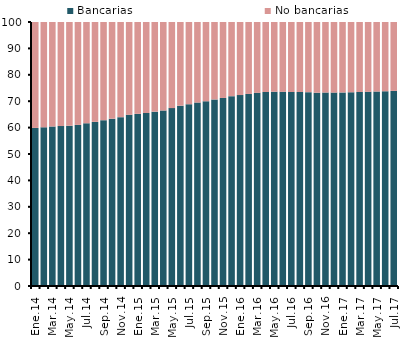
| Category | Bancarias | No bancarias |
|---|---|---|
| Ene.14 | 59.874 | 40.126 |
| Feb.14 | 60.11 | 39.89 |
| Mar.14 | 60.421 | 39.579 |
| Abr.14 | 60.587 | 39.413 |
| May.14 | 60.715 | 39.285 |
| Jun.14 | 61.019 | 38.981 |
| Jul.14 | 61.641 | 38.359 |
| Ago.14 | 62.168 | 37.832 |
| Sep.14 | 62.806 | 37.194 |
| Oct.14 | 63.38 | 36.62 |
| Nov.14 | 63.963 | 36.037 |
| Dic.14 | 64.85 | 35.15 |
| Ene.15 | 65.198 | 34.802 |
| Feb.15 | 65.527 | 34.473 |
| Mar.15 | 66.034 | 33.966 |
| Abr.15 | 66.476 | 33.524 |
| May.15 | 67.379 | 32.621 |
| Jun.15 | 68.294 | 31.706 |
| Jul.15 | 68.857 | 31.143 |
| Ago.15 | 69.482 | 30.518 |
| Sep.15 | 69.972 | 30.028 |
| Oct.15 | 70.666 | 29.334 |
| Nov.15 | 71.225 | 28.775 |
| Dic.15 | 71.91 | 28.09 |
| Ene.16 | 72.32 | 27.68 |
| Feb.16 | 72.744 | 27.256 |
| Mar.16 | 73.166 | 26.834 |
| Abr.16 | 73.479 | 26.521 |
| May.16 | 73.588 | 26.412 |
| Jun.16 | 73.554 | 26.446 |
| Jul.16 | 73.477 | 26.523 |
| Ago.16 | 73.495 | 26.505 |
| Sep.16 | 73.435 | 26.565 |
| Oct.16 | 73.211 | 26.789 |
| Nov.16 | 73.279 | 26.721 |
| Dic.16 | 73.254 | 26.746 |
| Ene.17 | 73.327 | 26.673 |
| Feb.17 | 73.382 | 26.618 |
| Mar.17 | 73.478 | 26.522 |
| Abr.17 | 73.55 | 26.45 |
| May.17 | 73.663 | 26.337 |
| Jun.17 | 73.763 | 26.237 |
| Jul.17 | 73.908 | 26.092 |